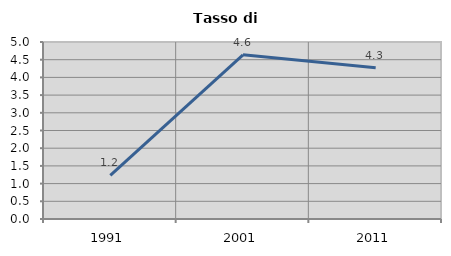
| Category | Tasso di disoccupazione   |
|---|---|
| 1991.0 | 1.235 |
| 2001.0 | 4.637 |
| 2011.0 | 4.272 |